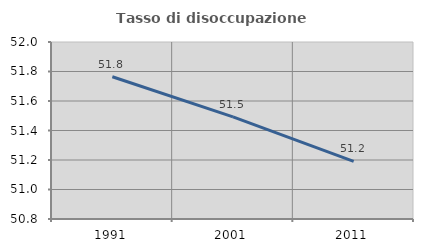
| Category | Tasso di disoccupazione giovanile  |
|---|---|
| 1991.0 | 51.765 |
| 2001.0 | 51.493 |
| 2011.0 | 51.19 |